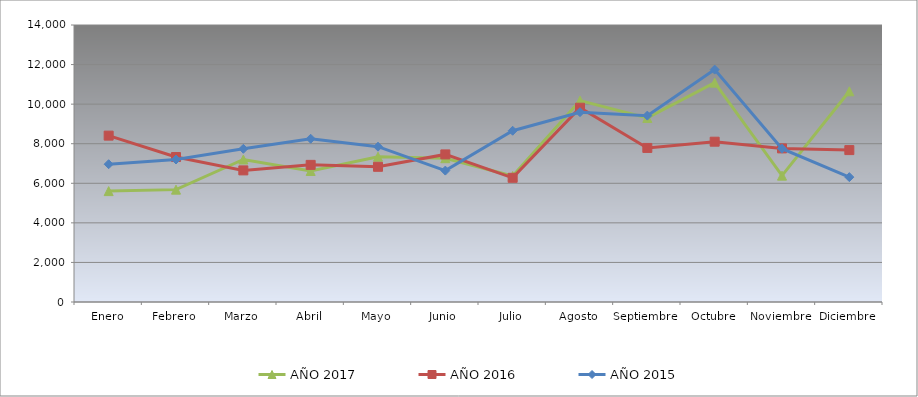
| Category | AÑO 2017 | AÑO 2016 | AÑO 2015 |
|---|---|---|---|
| Enero | 5604.886 | 8408.193 | 6963.729 |
| Febrero | 5679.29 | 7326.873 | 7201.906 |
| Marzo | 7202.607 | 6652.32 | 7742.45 |
| Abril | 6622.805 | 6931.124 | 8250.9 |
| Mayo | 7342.313 | 6833.246 | 7849.715 |
| Junio | 7267.909 | 7459.92 | 6641.092 |
| Julio | 6366.346 | 6276.908 | 8655.463 |
| Agosto | 10178.396 | 9819.163 | 9593.814 |
| Septiembre | 9303.746 | 7787.027 | 9418.982 |
| Octubre | 11086.291 | 8101.847 | 11745.855 |
| Noviembre | 6386.926 | 7764.147 | 7750.052 |
| Diciembre | 10648.57 | 7676.861 | 6310.853 |